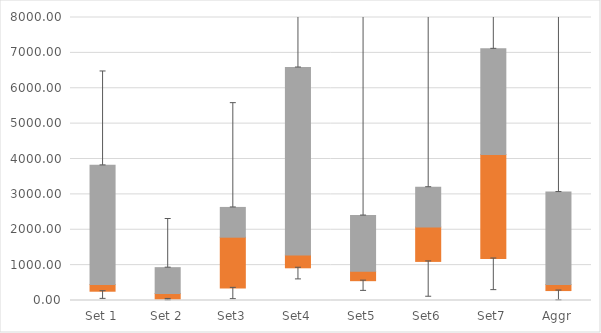
| Category | Q1 | Median-Q1 | Q3-Median |
|---|---|---|---|
| Set 1 | 262.42 | 191.104 | 3366.661 |
| Set 2 | 42.812 | 155.188 | 730.897 |
| Set3 | 356.171 | 1433.594 | 841.4 |
| Set4 | 924.39 | 364.249 | 5298.229 |
| Set5 | 560.473 | 263.255 | 1578.606 |
| Set6 | 1104.865 | 973.254 | 1124.999 |
| Set7 | 1186.183 | 2943.046 | 2985.781 |
| Aggr | 280.866 | 172.657 | 2613.06 |